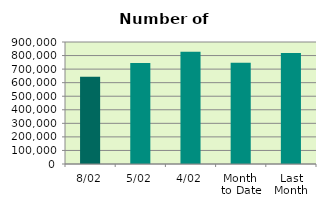
| Category | Series 0 |
|---|---|
| 8/02 | 644564 |
| 5/02 | 745706 |
| 4/02 | 827750 |
| Month 
to Date | 746077.333 |
| Last
Month | 819236.4 |